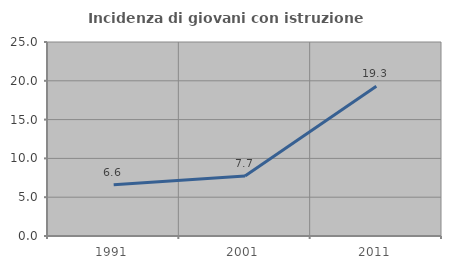
| Category | Incidenza di giovani con istruzione universitaria |
|---|---|
| 1991.0 | 6.609 |
| 2001.0 | 7.727 |
| 2011.0 | 19.304 |